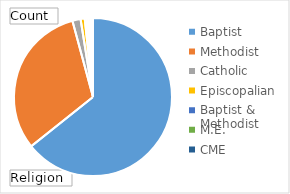
| Category | Total |
|---|---|
| Baptist | 153 |
| Methodist | 75 |
| Catholic | 4 |
| Episcopalian | 2 |
| Baptist & Methodist | 1 |
| M.E. | 1 |
| CME | 1 |
| A.M.E. | 1 |